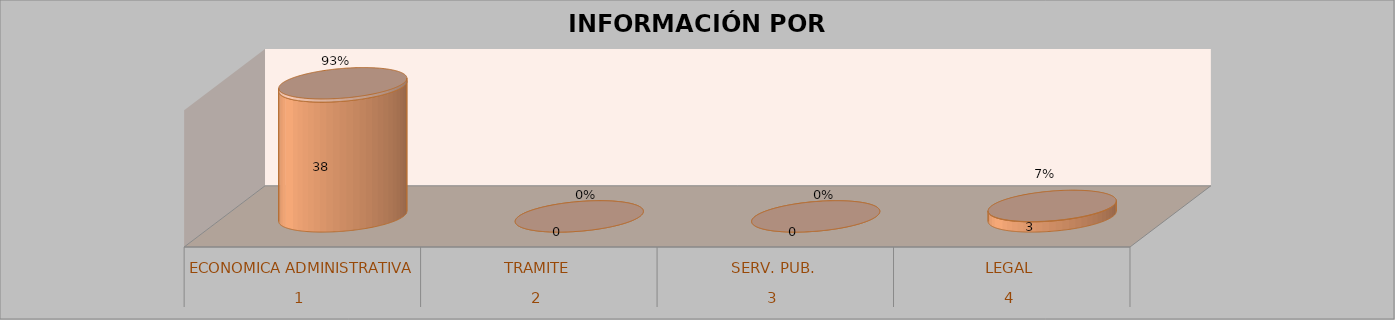
| Category | Series 0 | Series 1 | Series 2 | Series 3 |
|---|---|---|---|---|
| 0 |  |  | 38 | 0.927 |
| 1 |  |  | 0 | 0 |
| 2 |  |  | 0 | 0 |
| 3 |  |  | 3 | 0.073 |